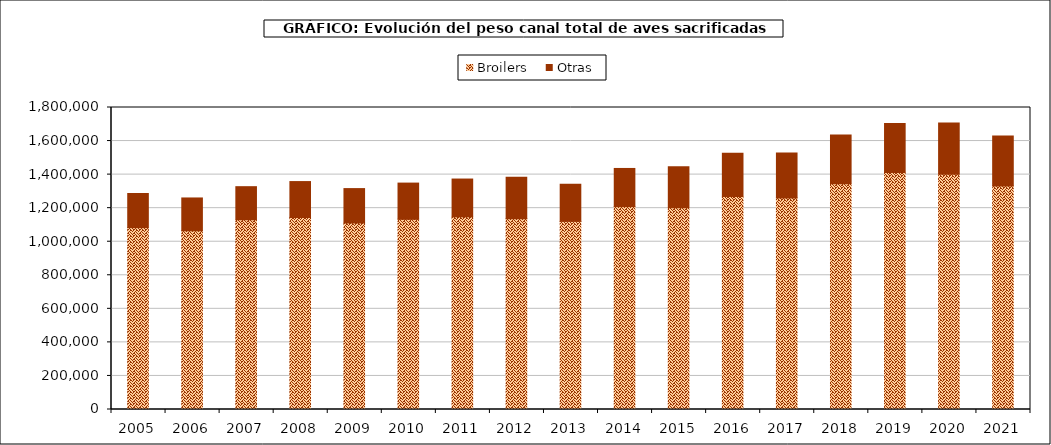
| Category | Broilers | Otras |
|---|---|---|
| 2005.0 | 1083967.626 | 203454.751 |
| 2006.0 | 1064943.635 | 195909.128 |
| 2007.0 | 1131030.91 | 197060.388 |
| 2008.0 | 1144285.376 | 214254.063 |
| 2009.0 | 1111683.614 | 204985.916 |
| 2010.0 | 1133430.435 | 215999.184 |
| 2011.0 | 1148388.725 | 225215.047 |
| 2012.0 | 1137190.775 | 247051.951 |
| 2013.0 | 1121294.618 | 221283.736 |
| 2014.0 | 1209068.651 | 227620.21 |
| 2015.0 | 1203021.781 | 243968.571 |
| 2016.0 | 1269476.951 | 257153.803 |
| 2017.0 | 1259941.852 | 268903.127 |
| 2018.0 | 1345687.02 | 291131.521 |
| 2019.0 | 1412223.192 | 292967.022 |
| 2020.0 | 1401408.581 | 306589.115 |
| 2021.0 | 1331407.473 | 298046.301 |